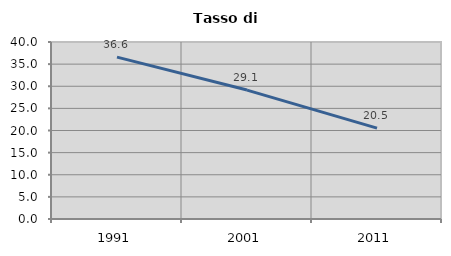
| Category | Tasso di disoccupazione   |
|---|---|
| 1991.0 | 36.588 |
| 2001.0 | 29.137 |
| 2011.0 | 20.544 |